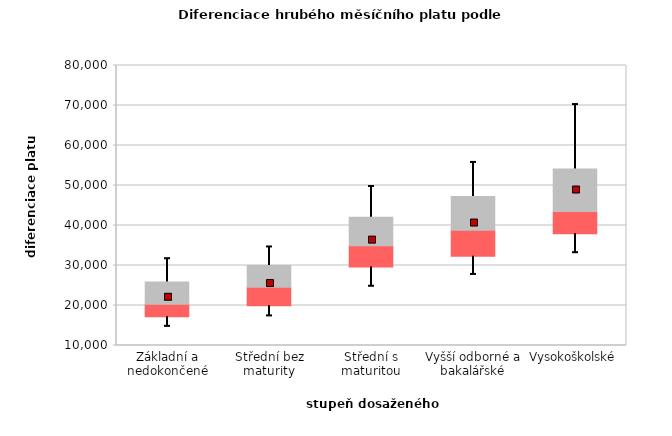
| Category | 0.25 | 0.5 | 0.75 |
|---|---|---|---|
| Základní a nedokončené | 17173.557 | 3156.943 | 5549.106 |
| Střední bez maturity | 19930.667 | 4614.618 | 5479.15 |
| Střední s maturitou | 29646.58 | 5263.011 | 7123.064 |
| Vyšší odborné a bakalářské | 32326.682 | 6503.892 | 8449.655 |
| Vysokoškolské | 37910.822 | 5585.067 | 10629.934 |